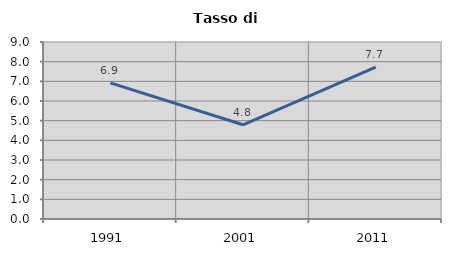
| Category | Tasso di disoccupazione   |
|---|---|
| 1991.0 | 6.919 |
| 2001.0 | 4.791 |
| 2011.0 | 7.717 |